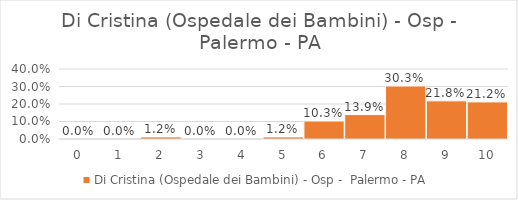
| Category | Di Cristina (Ospedale dei Bambini) - Osp -  Palermo - PA |
|---|---|
| 0.0 | 0 |
| 1.0 | 0 |
| 2.0 | 0.012 |
| 3.0 | 0 |
| 4.0 | 0 |
| 5.0 | 0.012 |
| 6.0 | 0.103 |
| 7.0 | 0.139 |
| 8.0 | 0.303 |
| 9.0 | 0.218 |
| 10.0 | 0.212 |